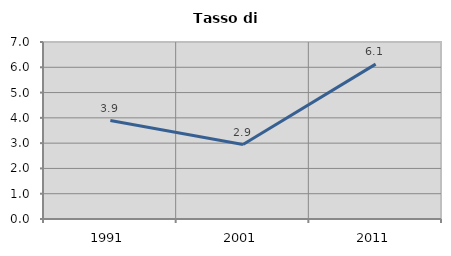
| Category | Tasso di disoccupazione   |
|---|---|
| 1991.0 | 3.893 |
| 2001.0 | 2.944 |
| 2011.0 | 6.124 |